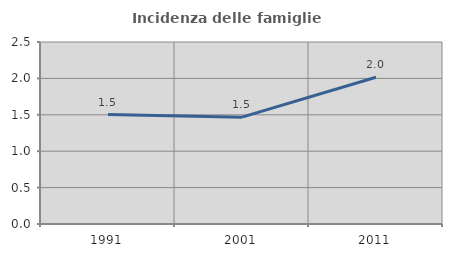
| Category | Incidenza delle famiglie numerose |
|---|---|
| 1991.0 | 1.503 |
| 2001.0 | 1.468 |
| 2011.0 | 2.016 |